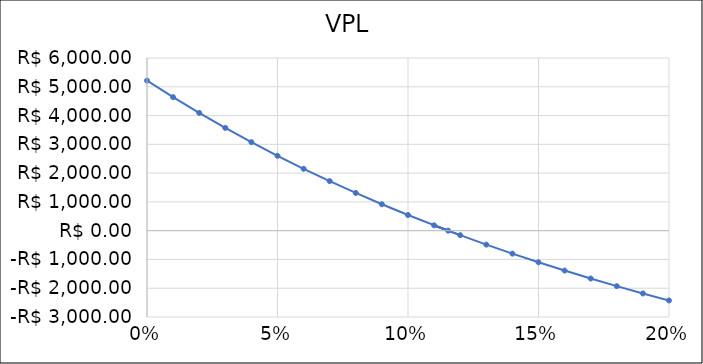
| Category | VPL |
|---|---|
| 0.0 | 5215 |
| 0.01 | 4639.354 |
| 0.02 | 4091.825 |
| 0.03 | 3570.725 |
| 0.04 | 3074.484 |
| 0.05 | 2601.64 |
| 0.06 | 2150.832 |
| 0.07 | 1720.792 |
| 0.08 | 1310.338 |
| 0.09 | 918.364 |
| 0.1 | 543.84 |
| 0.11537 | 0.024 |
| 0.11 | 185.803 |
| 0.12 | -156.649 |
| 0.13 | -484.359 |
| 0.14 | -798.117 |
| 0.15 | -1098.662 |
| 0.16 | -1386.689 |
| 0.17 | -1662.849 |
| 0.18 | -1927.753 |
| 0.19 | -2181.975 |
| 0.2 | -2426.055 |